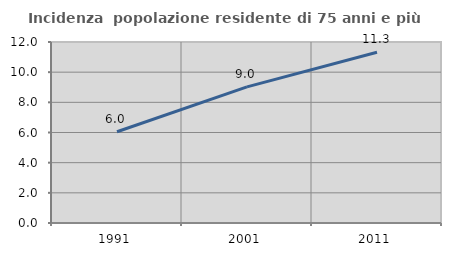
| Category | Incidenza  popolazione residente di 75 anni e più |
|---|---|
| 1991.0 | 6.05 |
| 2001.0 | 9.024 |
| 2011.0 | 11.316 |